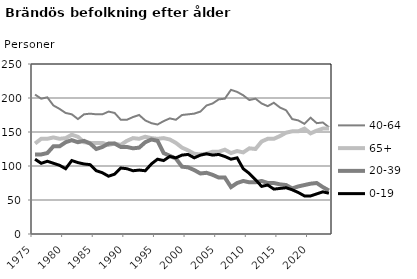
| Category | 40-64 | 65+ | 20-39 | 0-19 |
|---|---|---|---|---|
| 1975.0 | 205 | 133 | 117 | 110 |
| 1976.0 | 199 | 140 | 117 | 104 |
| 1977.0 | 201 | 140 | 119 | 107 |
| 1978.0 | 189 | 142 | 129 | 104 |
| 1979.0 | 184 | 140 | 129 | 101 |
| 1980.0 | 178 | 141 | 135 | 96 |
| 1981.0 | 176 | 146 | 138 | 108 |
| 1982.0 | 169 | 143 | 135 | 105 |
| 1983.0 | 176 | 135 | 137 | 103 |
| 1984.0 | 177 | 134 | 133 | 102 |
| 1985.0 | 176 | 134 | 125 | 93 |
| 1986.0 | 176 | 134 | 128 | 90 |
| 1987.0 | 180 | 131 | 133 | 85 |
| 1988.0 | 178 | 133 | 133 | 88 |
| 1989.0 | 168 | 131 | 128 | 97 |
| 1990.0 | 168 | 137 | 128 | 96 |
| 1991.0 | 172 | 141 | 126 | 93 |
| 1992.0 | 175 | 140 | 127 | 94 |
| 1993.0 | 167 | 143 | 135 | 93 |
| 1994.0 | 163 | 141 | 139 | 103 |
| 1995.0 | 161 | 140 | 137 | 110 |
| 1996.0 | 166 | 141 | 119 | 108 |
| 1997.0 | 170 | 139 | 115 | 114 |
| 1998.0 | 168 | 134 | 111 | 112 |
| 1999.0 | 175 | 127 | 99 | 116 |
| 2000.0 | 176 | 123 | 98 | 117 |
| 2001.0 | 177 | 118 | 94 | 112 |
| 2002.0 | 180 | 117 | 89 | 116 |
| 2003.0 | 189 | 118 | 90 | 118 |
| 2004.0 | 192 | 121 | 87 | 116 |
| 2005.0 | 198 | 121 | 83 | 117 |
| 2006.0 | 199 | 124 | 83 | 114 |
| 2007.0 | 212 | 119 | 69 | 110 |
| 2008.0 | 209 | 122 | 75 | 112 |
| 2009.0 | 204 | 120 | 78 | 96 |
| 2010.0 | 197 | 126 | 76 | 89 |
| 2011.0 | 199 | 125 | 76 | 80 |
| 2012.0 | 192 | 136 | 78 | 70 |
| 2013.0 | 188 | 140 | 75 | 72 |
| 2014.0 | 193 | 140 | 75 | 66 |
| 2015.0 | 186 | 144 | 73 | 67 |
| 2016.0 | 182 | 149 | 72 | 68 |
| 2017.0 | 169 | 151 | 67 | 65 |
| 2018.0 | 167 | 151 | 70 | 61 |
| 2019.0 | 162 | 155 | 72 | 56 |
| 2020.0 | 171 | 148 | 74 | 56 |
| 2021.0 | 163 | 152 | 75 | 59 |
| 2022.0 | 164 | 155 | 69 | 62 |
| 2023.0 | 157 | 155 | 64 | 60 |